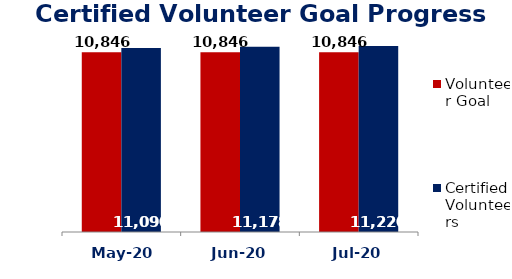
| Category | Volunteer Goal  | Certified Volunteers  |
|---|---|---|
| May-20 | 10846 | 11090 |
| Jun-20 | 10846 | 11178 |
| Jul-20 | 10846 | 11220 |